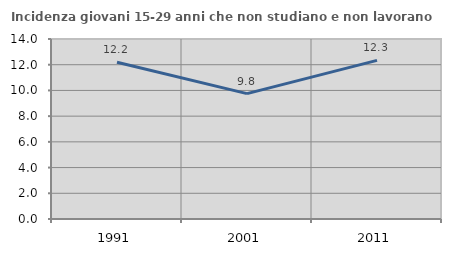
| Category | Incidenza giovani 15-29 anni che non studiano e non lavorano  |
|---|---|
| 1991.0 | 12.191 |
| 2001.0 | 9.752 |
| 2011.0 | 12.334 |